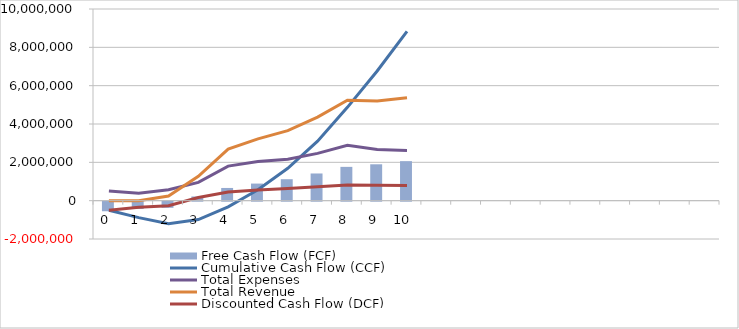
| Category | Free Cash Flow (FCF) |
|---|---|
| 0  | -500000 |
| 1  | -384065.934 |
| 2  | -320934.066 |
| 3  | 218337.5 |
| 4  | 662839.825 |
| 5  | 891841.829 |
| 6  | 1119672.349 |
| 7  | 1418267.548 |
| 8  | 1763314.909 |
| 9  | 1898106.646 |
| 10  | 2061492.347 |
|   | 0 |
|   | 0 |
|   | 0 |
|   | 0 |
|   | 0 |
|   | 0 |
|   | 0 |
|   | 0 |
|   | 0 |
|   | 0 |